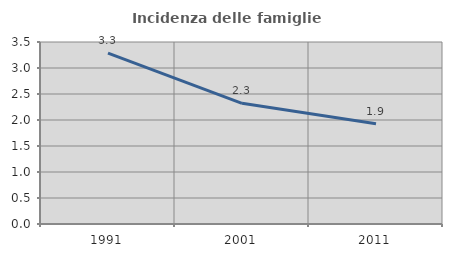
| Category | Incidenza delle famiglie numerose |
|---|---|
| 1991.0 | 3.285 |
| 2001.0 | 2.32 |
| 2011.0 | 1.929 |